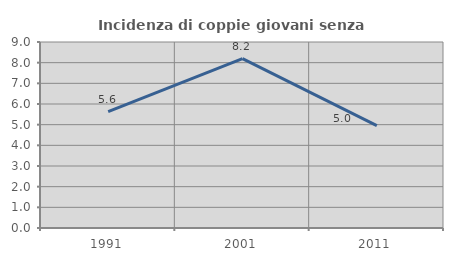
| Category | Incidenza di coppie giovani senza figli |
|---|---|
| 1991.0 | 5.628 |
| 2001.0 | 8.198 |
| 2011.0 | 4.95 |